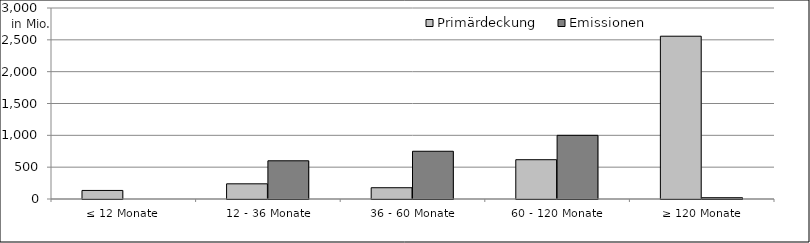
| Category | Primärdeckung | Emissionen |
|---|---|---|
| ≤ 12 Monate | 134430352.95 | 0 |
| 12 - 36 Monate | 238447536.64 | 600055460.3 |
| 36 - 60 Monate | 177005813.57 | 750000000 |
| 60 - 120 Monate | 617206221.23 | 1000000000 |
| ≥ 120 Monate | 2556794965.45 | 20000000 |